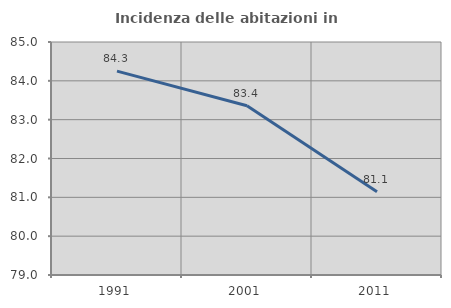
| Category | Incidenza delle abitazioni in proprietà  |
|---|---|
| 1991.0 | 84.25 |
| 2001.0 | 83.358 |
| 2011.0 | 81.143 |